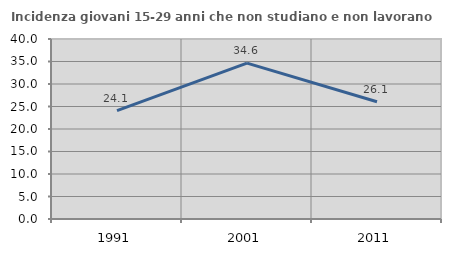
| Category | Incidenza giovani 15-29 anni che non studiano e non lavorano  |
|---|---|
| 1991.0 | 24.084 |
| 2001.0 | 34.639 |
| 2011.0 | 26.059 |